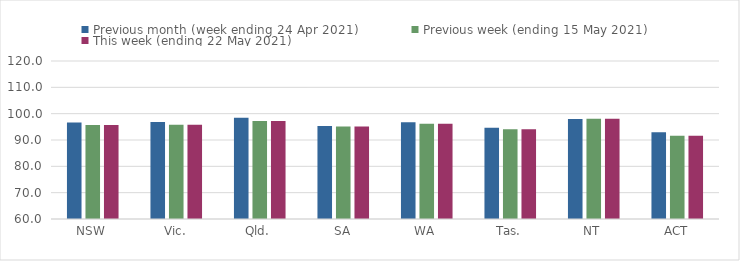
| Category | Previous month (week ending 24 Apr 2021) | Previous week (ending 15 May 2021) | This week (ending 22 May 2021) |
|---|---|---|---|
| NSW | 96.61 | 95.67 | 95.67 |
| Vic. | 96.84 | 95.82 | 95.82 |
| Qld. | 98.48 | 97.23 | 97.23 |
| SA | 95.27 | 95.08 | 95.08 |
| WA | 96.71 | 96.2 | 96.2 |
| Tas. | 94.65 | 94.08 | 94.08 |
| NT | 97.98 | 98.09 | 98.09 |
| ACT | 92.97 | 91.65 | 91.65 |